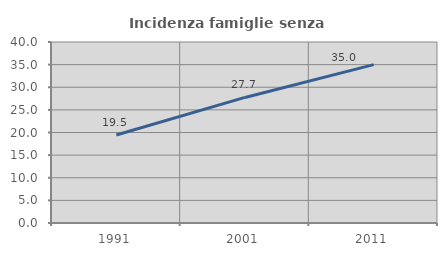
| Category | Incidenza famiglie senza nuclei |
|---|---|
| 1991.0 | 19.453 |
| 2001.0 | 27.75 |
| 2011.0 | 35.002 |